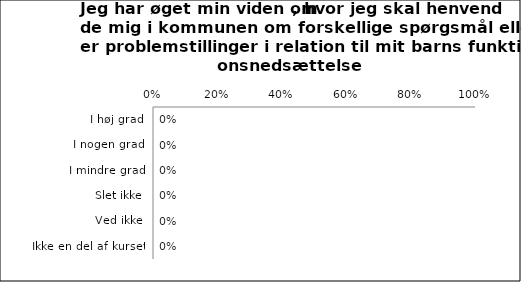
| Category | Øget viden om, hvor jeg skal henvende mig i kommenen med spørgsmål eller problemstillinger i relation til mit barns funktionsnedsættelse |
|---|---|
| I høj grad | 0 |
| I nogen grad | 0 |
| I mindre grad | 0 |
| Slet ikke | 0 |
| Ved ikke | 0 |
| Ikke en del af kurset | 0 |